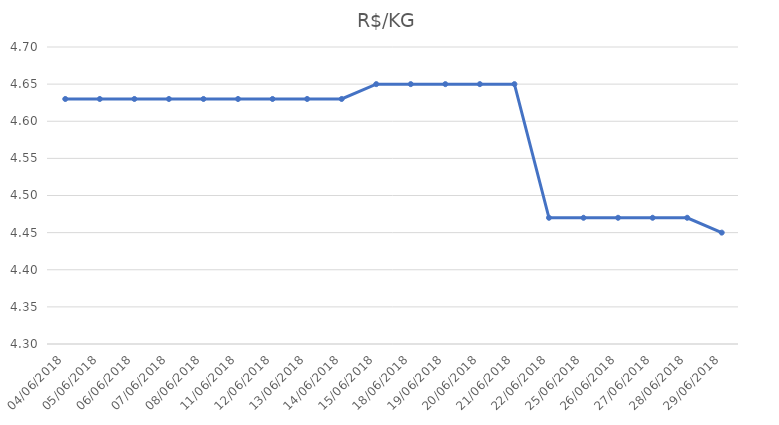
| Category | R$/KG |
|---|---|
| 04/06/2018 | 4.63 |
| 05/06/2018 | 4.63 |
| 06/06/2018 | 4.63 |
| 07/06/2018 | 4.63 |
| 08/06/2018 | 4.63 |
| 11/06/2018 | 4.63 |
| 12/06/2018 | 4.63 |
| 13/06/2018 | 4.63 |
| 14/06/2018 | 4.63 |
| 15/06/2018 | 4.65 |
| 18/06/2018 | 4.65 |
| 19/06/2018 | 4.65 |
| 20/06/2018 | 4.65 |
| 21/06/2018 | 4.65 |
| 22/06/2018 | 4.47 |
| 25/06/2018 | 4.47 |
| 26/06/2018 | 4.47 |
| 27/06/2018 | 4.47 |
| 28/06/2018 | 4.47 |
| 29/06/2018 | 4.45 |